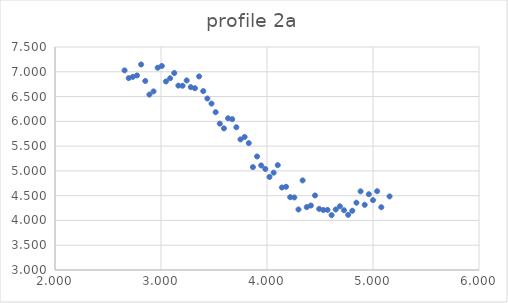
| Category | Series 0 |
|---|---|
| 2.65625 | 7.028 |
| 2.6953125 | 6.872 |
| 2.734375 | 6.897 |
| 2.7734375 | 6.926 |
| 2.8125 | 7.147 |
| 2.8515625 | 6.814 |
| 2.890625 | 6.54 |
| 2.9296875 | 6.604 |
| 2.96875 | 7.082 |
| 3.0078125 | 7.117 |
| 3.046875 | 6.805 |
| 3.0859375 | 6.869 |
| 3.125 | 6.975 |
| 3.1640625 | 6.721 |
| 3.203125 | 6.718 |
| 3.2421875 | 6.825 |
| 3.28125 | 6.69 |
| 3.3203125 | 6.668 |
| 3.359375 | 6.906 |
| 3.3984375 | 6.61 |
| 3.4375 | 6.461 |
| 3.4765625 | 6.358 |
| 3.515625 | 6.184 |
| 3.5546875 | 5.953 |
| 3.59375 | 5.858 |
| 3.6328125 | 6.062 |
| 3.671875 | 6.044 |
| 3.7109375 | 5.88 |
| 3.75 | 5.635 |
| 3.7890625 | 5.684 |
| 3.828125 | 5.561 |
| 3.8671875 | 5.076 |
| 3.90625 | 5.291 |
| 3.9453125 | 5.11 |
| 3.984375 | 5.038 |
| 4.0234375 | 4.878 |
| 4.0625 | 4.964 |
| 4.1015625 | 5.116 |
| 4.140625 | 4.665 |
| 4.1796875 | 4.679 |
| 4.21875 | 4.47 |
| 4.2578125 | 4.464 |
| 4.296875 | 4.221 |
| 4.3359375 | 4.808 |
| 4.375 | 4.269 |
| 4.4140625 | 4.301 |
| 4.453125 | 4.504 |
| 4.4921875 | 4.233 |
| 4.53125 | 4.211 |
| 4.5703125 | 4.213 |
| 4.609375 | 4.107 |
| 4.6484375 | 4.221 |
| 4.6875 | 4.285 |
| 4.7265625 | 4.206 |
| 4.765625 | 4.113 |
| 4.8046875 | 4.195 |
| 4.84375 | 4.358 |
| 4.8828125 | 4.587 |
| 4.921875 | 4.315 |
| 4.9609375 | 4.529 |
| 5.0 | 4.41 |
| 5.0390625 | 4.59 |
| 5.078125 | 4.267 |
| 5.15625 | 4.485 |